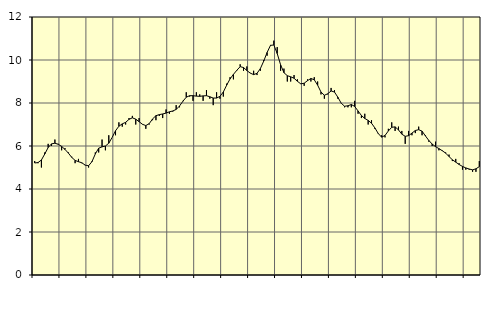
| Category | Piggar | Series 1 |
|---|---|---|
| nan | 5.3 | 5.21 |
| 87.0 | 5.2 | 5.23 |
| 87.0 | 5 | 5.35 |
| 87.0 | 5.7 | 5.63 |
| nan | 6.1 | 5.93 |
| 88.0 | 6 | 6.1 |
| 88.0 | 6.3 | 6.13 |
| 88.0 | 6.1 | 6.08 |
| nan | 5.8 | 5.98 |
| 89.0 | 5.9 | 5.84 |
| 89.0 | 5.7 | 5.67 |
| 89.0 | 5.5 | 5.47 |
| nan | 5.2 | 5.33 |
| 90.0 | 5.4 | 5.27 |
| 90.0 | 5.2 | 5.22 |
| 90.0 | 5.1 | 5.11 |
| nan | 5 | 5.08 |
| 91.0 | 5.3 | 5.27 |
| 91.0 | 5.7 | 5.63 |
| 91.0 | 5.7 | 5.9 |
| nan | 6.3 | 5.96 |
| 92.0 | 5.8 | 6 |
| 92.0 | 6.5 | 6.13 |
| 92.0 | 6.4 | 6.4 |
| nan | 6.5 | 6.71 |
| 93.0 | 7.1 | 6.92 |
| 93.0 | 6.9 | 7.03 |
| 93.0 | 7 | 7.1 |
| nan | 7.3 | 7.24 |
| 94.0 | 7.4 | 7.31 |
| 94.0 | 7 | 7.25 |
| 94.0 | 7.3 | 7.13 |
| nan | 7 | 7.01 |
| 95.0 | 6.8 | 6.95 |
| 95.0 | 7 | 7.04 |
| 95.0 | 7.2 | 7.26 |
| nan | 7.2 | 7.41 |
| 96.0 | 7.4 | 7.46 |
| 96.0 | 7.3 | 7.49 |
| 96.0 | 7.7 | 7.53 |
| nan | 7.5 | 7.59 |
| 97.0 | 7.6 | 7.63 |
| 97.0 | 7.9 | 7.7 |
| 97.0 | 7.8 | 7.86 |
| nan | 8.1 | 8.08 |
| 98.0 | 8.5 | 8.27 |
| 98.0 | 8.3 | 8.34 |
| 98.0 | 8.1 | 8.34 |
| nan | 8.5 | 8.32 |
| 99.0 | 8.4 | 8.31 |
| 99.0 | 8.1 | 8.33 |
| 99.0 | 8.6 | 8.34 |
| nan | 8.2 | 8.29 |
| 0.0 | 7.9 | 8.23 |
| 0.0 | 8.5 | 8.23 |
| 0.0 | 8.2 | 8.31 |
| nan | 8.3 | 8.51 |
| 1.0 | 8.9 | 8.83 |
| 1.0 | 9.2 | 9.12 |
| 1.0 | 9.1 | 9.33 |
| nan | 9.5 | 9.52 |
| 2.0 | 9.8 | 9.69 |
| 2.0 | 9.5 | 9.65 |
| 2.0 | 9.7 | 9.51 |
| nan | 9.4 | 9.39 |
| 3.0 | 9.5 | 9.32 |
| 3.0 | 9.3 | 9.38 |
| 3.0 | 9.5 | 9.6 |
| nan | 10 | 9.95 |
| 4.0 | 10.2 | 10.35 |
| 4.0 | 10.7 | 10.68 |
| 4.0 | 10.9 | 10.7 |
| nan | 10.6 | 10.3 |
| 5.0 | 9.5 | 9.78 |
| 5.0 | 9.6 | 9.41 |
| 5.0 | 9 | 9.27 |
| nan | 9 | 9.22 |
| 6.0 | 9.3 | 9.15 |
| 6.0 | 9.1 | 9.01 |
| 6.0 | 8.9 | 8.89 |
| nan | 8.8 | 8.92 |
| 7.0 | 9.1 | 9.04 |
| 7.0 | 9 | 9.14 |
| 7.0 | 9.2 | 9.08 |
| nan | 9 | 8.83 |
| 8.0 | 8.4 | 8.51 |
| 8.0 | 8.2 | 8.36 |
| 8.0 | 8.4 | 8.43 |
| nan | 8.7 | 8.56 |
| 9.0 | 8.6 | 8.51 |
| 9.0 | 8.2 | 8.27 |
| 9.0 | 8 | 7.99 |
| nan | 7.8 | 7.85 |
| 10.0 | 7.8 | 7.87 |
| 10.0 | 7.8 | 7.93 |
| 10.0 | 8.1 | 7.84 |
| nan | 7.5 | 7.63 |
| 11.0 | 7.3 | 7.42 |
| 11.0 | 7.5 | 7.28 |
| 11.0 | 7 | 7.19 |
| nan | 7.2 | 7.06 |
| 12.0 | 6.8 | 6.84 |
| 12.0 | 6.6 | 6.58 |
| 12.0 | 6.5 | 6.41 |
| nan | 6.4 | 6.49 |
| 13.0 | 6.8 | 6.7 |
| 13.0 | 7.1 | 6.87 |
| 13.0 | 6.7 | 6.89 |
| nan | 6.9 | 6.75 |
| 14.0 | 6.7 | 6.55 |
| 14.0 | 6.1 | 6.45 |
| 14.0 | 6.7 | 6.48 |
| nan | 6.5 | 6.6 |
| 15.0 | 6.6 | 6.72 |
| 15.0 | 6.9 | 6.76 |
| 15.0 | 6.5 | 6.69 |
| nan | 6.5 | 6.47 |
| 16.0 | 6.2 | 6.26 |
| 16.0 | 6 | 6.09 |
| 16.0 | 6.2 | 5.97 |
| nan | 5.8 | 5.88 |
| 17.0 | 5.8 | 5.78 |
| 17.0 | 5.7 | 5.67 |
| 17.0 | 5.6 | 5.51 |
| nan | 5.3 | 5.36 |
| 18.0 | 5.4 | 5.25 |
| 18.0 | 5.2 | 5.14 |
| 18.0 | 4.9 | 5.05 |
| nan | 4.9 | 4.98 |
| 19.0 | 4.9 | 4.93 |
| 19.0 | 4.8 | 4.89 |
| 19.0 | 4.8 | 4.94 |
| nan | 5.3 | 5.04 |